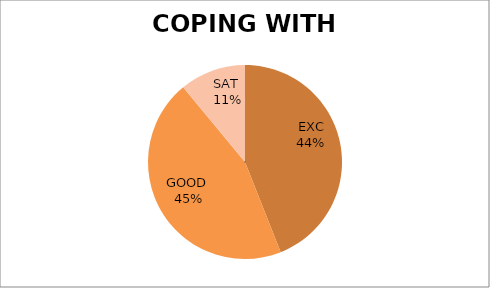
| Category | Series 0 |
|---|---|
| EXC | 44 |
| GOOD  | 45 |
| SAT  | 11 |